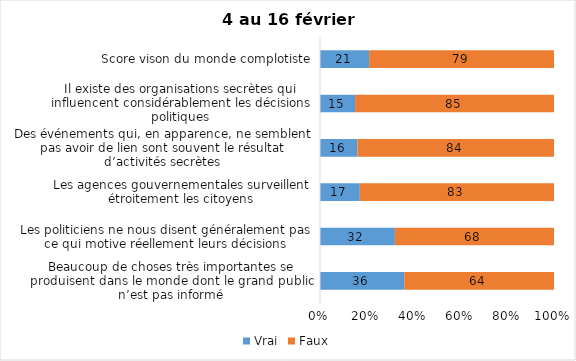
| Category | Vrai | Faux |
|---|---|---|
| Beaucoup de choses très importantes se produisent dans le monde dont le grand public n’est pas informé | 36 | 64 |
| Les politiciens ne nous disent généralement pas ce qui motive réellement leurs décisions | 32 | 68 |
| Les agences gouvernementales surveillent étroitement les citoyens | 17 | 83 |
| Des événements qui, en apparence, ne semblent pas avoir de lien sont souvent le résultat d’activités secrètes | 16 | 84 |
| Il existe des organisations secrètes qui influencent considérablement les décisions politiques | 15 | 85 |
| Score vison du monde complotiste | 21 | 79 |